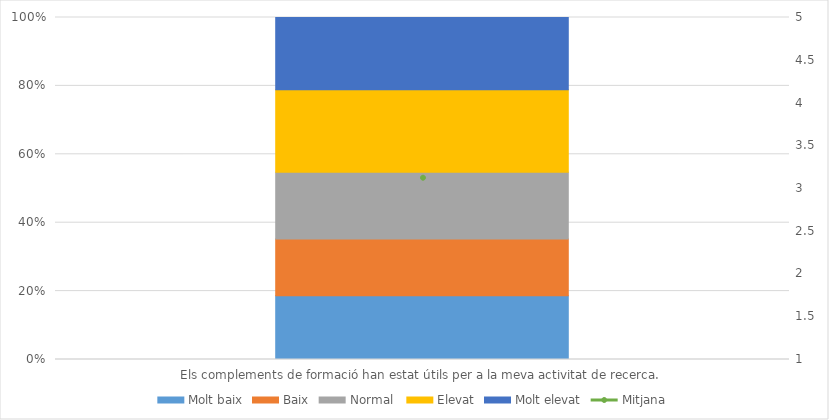
| Category | Molt baix | Baix | Normal  | Elevat | Molt elevat |
|---|---|---|---|---|---|
| Els complements de formació han estat útils per a la meva activitat de recerca. | 45 | 40 | 47 | 58 | 51 |